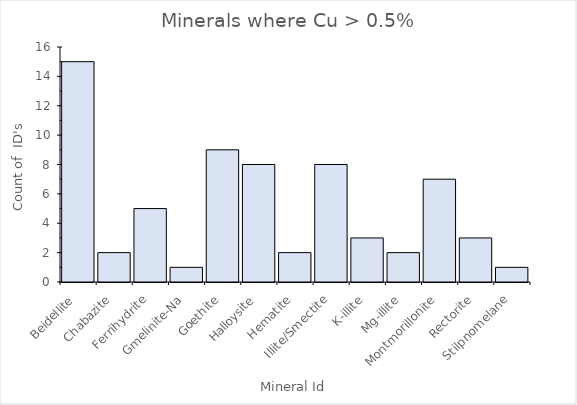
| Category | Total |
|---|---|
| Beidellite | 15 |
| Chabazite | 2 |
| Ferrihydrite | 5 |
| Gmelinite-Na | 1 |
| Goethite | 9 |
| Halloysite | 8 |
| Hematite | 2 |
| Illite/Smectite | 8 |
| K-illite | 3 |
| Mg-illite | 2 |
| Montmorillonite | 7 |
| Rectorite | 3 |
| Stilpnomelane | 1 |